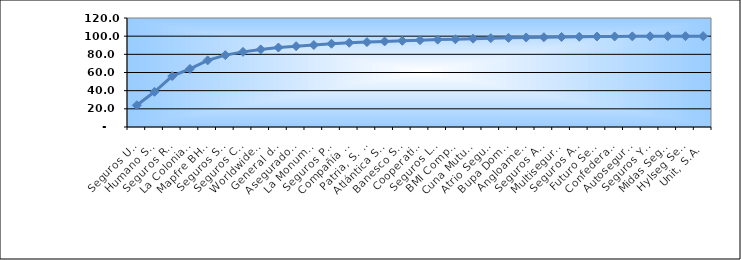
| Category | Series 0 |
|---|---|
| Seguros Universal, S. A. | 23.933 |
| Humano Seguros, S. A. | 38.749 |
| Seguros Reservas, S. A. | 56.045 |
| La Colonial, S. A., Compañia De Seguros | 63.919 |
| Mapfre BHD Compañía de Seguros | 73.349 |
| Seguros Sura, S.A. | 79.117 |
| Seguros Crecer, S. A. | 82.718 |
| Worldwide Seguros, S. A. | 85.393 |
| General de Seguros, S. A. | 87.501 |
| Aseguradora Agropecuaria Dominicana, S. A. | 88.99 |
| La Monumental de Seguros, S. A. | 90.24 |
| Seguros Pepín, S. A. | 91.681 |
| Compañía Dominicana de Seguros, C. por A. | 92.731 |
| Patria, S. A., Compañía de Seguros | 93.472 |
| Atlántica Seguros, S. A. | 94.236 |
| Banesco Seguros | 94.922 |
| Cooperativa Nacional De Seguros, Inc  | 95.6 |
| Seguros La Internacional, S. A. | 96.201 |
| BMI Compañía de Seguros, S. A. | 96.63 |
| Cuna Mutual Insurance Society Dominicana | 97.261 |
| Atrio Seguros S. A. | 97.82 |
| Bupa Dominicana, S. A. | 98.165 |
| Angloamericana de Seguros, S. A. | 98.58 |
| Seguros APS, S.R.L. | 98.812 |
| Multiseguros Su, S.A. | 99.112 |
| Seguros Ademi, S.A. | 99.361 |
| Futuro Seguros | 99.612 |
| Confederación del Canadá Dominicana, S. A. | 99.714 |
| Autoseguro, S. A. | 99.773 |
| Seguros Yunen, S.A. | 99.878 |
| Midas Seguros, S.A. | 99.91 |
| Hylseg Seguros S.A | 99.965 |
| Unit, S.A. | 100 |